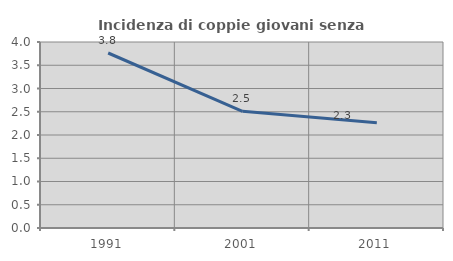
| Category | Incidenza di coppie giovani senza figli |
|---|---|
| 1991.0 | 3.763 |
| 2001.0 | 2.51 |
| 2011.0 | 2.262 |